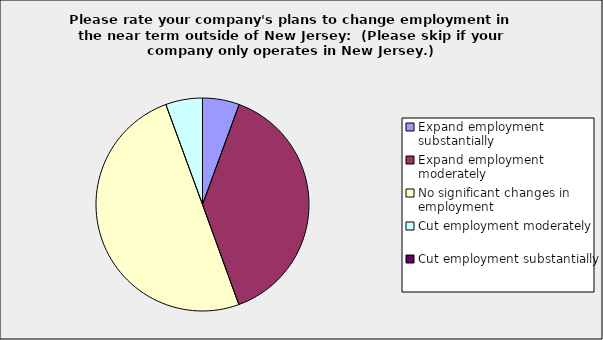
| Category | Series 0 |
|---|---|
| Expand employment substantially | 0.056 |
| Expand employment moderately | 0.389 |
| No significant changes in employment | 0.5 |
| Cut employment moderately | 0.056 |
| Cut employment substantially | 0 |